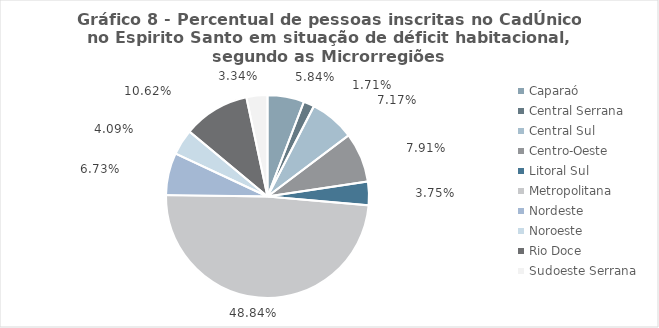
| Category | Series 0 |
|---|---|
| Caparaó | 0.058 |
| Central Serrana | 0.017 |
| Central Sul | 0.072 |
| Centro-Oeste | 0.079 |
| Litoral Sul | 0.038 |
| Metropolitana | 0.488 |
| Nordeste | 0.067 |
| Noroeste | 0.041 |
| Rio Doce | 0.106 |
| Sudoeste Serrana | 0.033 |